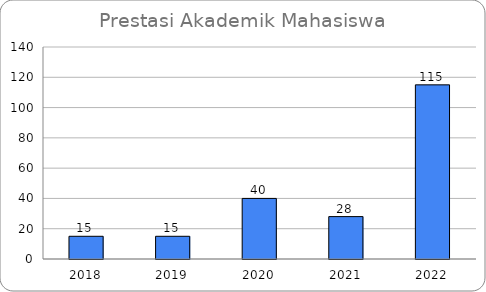
| Category | Jumlah |
|---|---|
| 2018.0 | 15 |
| 2019.0 | 15 |
| 2020.0 | 40 |
| 2021.0 | 28 |
| 2022.0 | 115 |